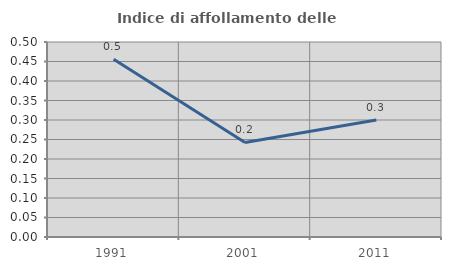
| Category | Indice di affollamento delle abitazioni  |
|---|---|
| 1991.0 | 0.456 |
| 2001.0 | 0.242 |
| 2011.0 | 0.3 |